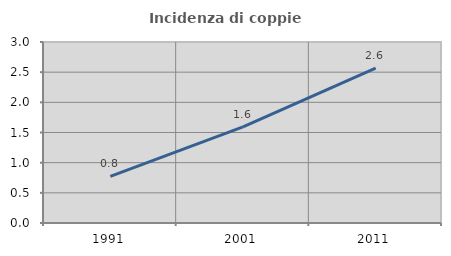
| Category | Incidenza di coppie miste |
|---|---|
| 1991.0 | 0.772 |
| 2001.0 | 1.594 |
| 2011.0 | 2.565 |